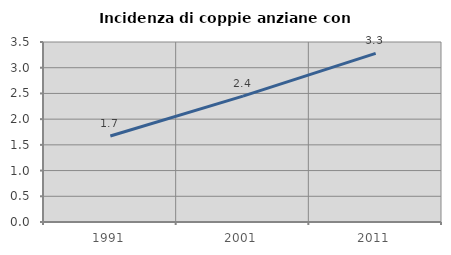
| Category | Incidenza di coppie anziane con figli |
|---|---|
| 1991.0 | 1.671 |
| 2001.0 | 2.447 |
| 2011.0 | 3.278 |